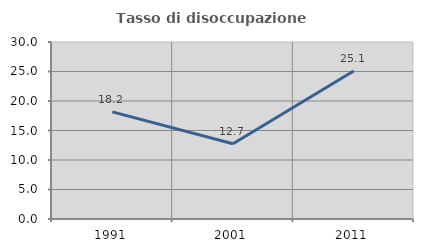
| Category | Tasso di disoccupazione giovanile  |
|---|---|
| 1991.0 | 18.159 |
| 2001.0 | 12.747 |
| 2011.0 | 25.07 |